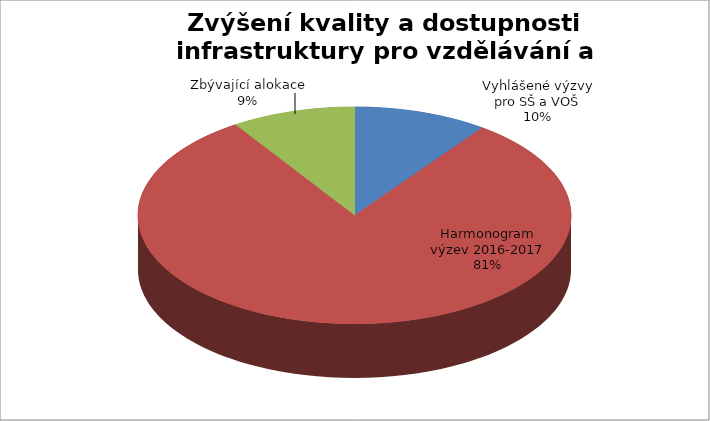
| Category | Series 0 |
|---|---|
| Vyhlášené výzvy pro SŠ a VOŠ | 1309999999.5 |
| Harmonogram výzev 2016-2017 | 10556897000 |
| Zbývající alokace | 1210218590.5 |